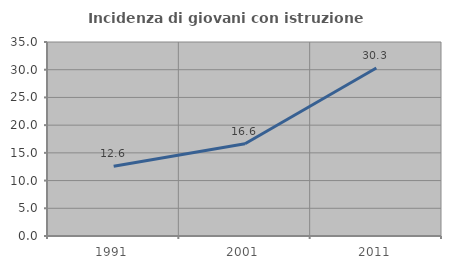
| Category | Incidenza di giovani con istruzione universitaria |
|---|---|
| 1991.0 | 12.591 |
| 2001.0 | 16.643 |
| 2011.0 | 30.308 |